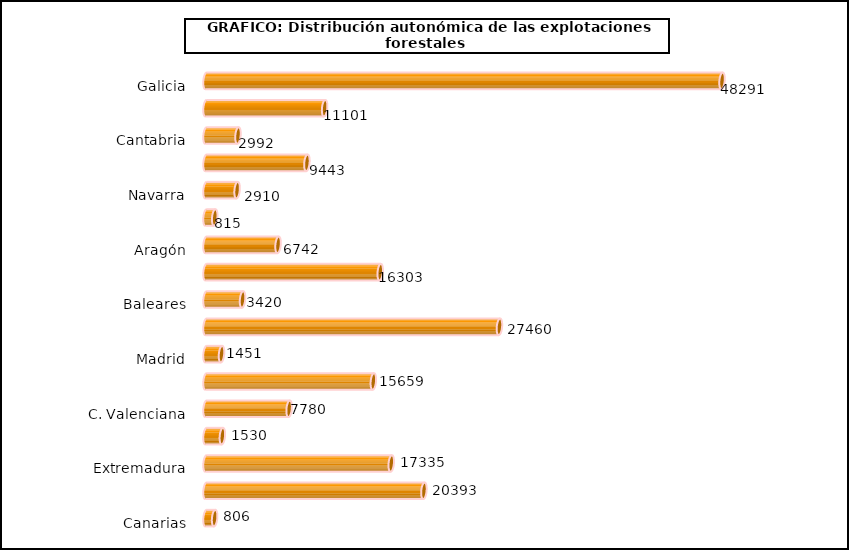
| Category | num. Explotaciones |
|---|---|
|   Galicia | 48291 |
|   P. de Asturias | 11101 |
|   Cantabria | 2992 |
|   País Vasco | 9443 |
|   Navarra | 2910 |
|   La Rioja | 815 |
|   Aragón | 6742 |
|   Cataluña | 16303 |
|   Baleares | 3420 |
|   Castilla y León | 27460 |
|   Madrid | 1451 |
|   Castilla-La Mancha | 15659 |
|   C. Valenciana | 7780 |
|   R. de Murcia | 1530 |
|   Extremadura | 17335 |
|   Andalucía | 20393 |
|   Canarias | 806 |